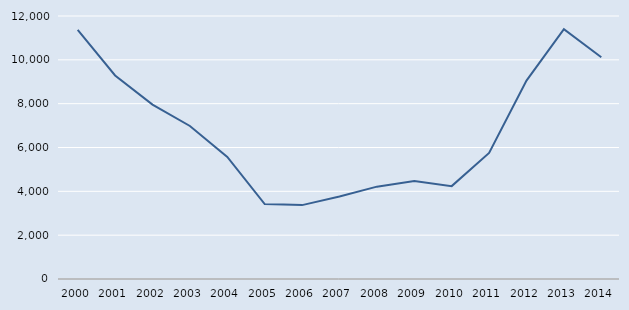
| Category | Series 0 |
|---|---|
| 2000.0 | 11369 |
| 2001.0 | 9287 |
| 2002.0 | 7955 |
| 2003.0 | 6981 |
| 2004.0 | 5570 |
| 2005.0 | 3418 |
| 2006.0 | 3371 |
| 2007.0 | 3766 |
| 2008.0 | 4214 |
| 2009.0 | 4468 |
| 2010.0 | 4238 |
| 2011.0 | 5752 |
| 2012.0 | 9054 |
| 2013.0 | 11401 |
| 2014.0 | 10121 |